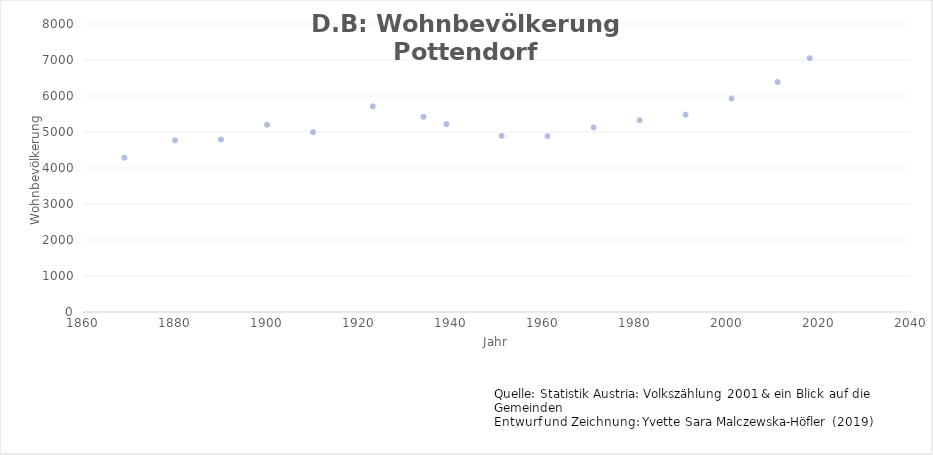
| Category | Wohnbevölkerung |
|---|---|
| 1869.0 | 4286 |
| 1880.0 | 4768 |
| 1890.0 | 4791 |
| 1900.0 | 5200 |
| 1910.0 | 4993 |
| 1923.0 | 5714 |
| 1934.0 | 5421 |
| 1939.0 | 5217 |
| 1951.0 | 4892 |
| 1961.0 | 4888 |
| 1971.0 | 5127 |
| 1981.0 | 5328 |
| 1991.0 | 5482 |
| 2001.0 | 5930 |
| 2011.0 | 6387 |
| 2018.0 | 7049 |